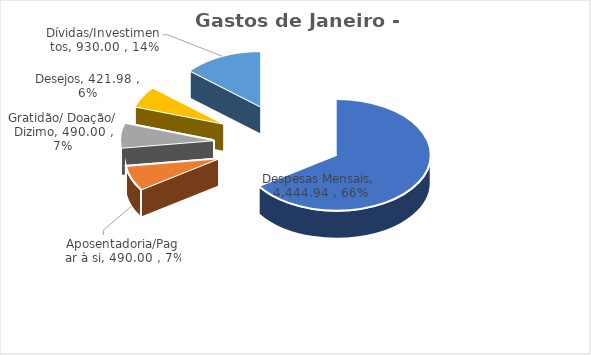
| Category | Gastos de Janeiro - Real |
|---|---|
| Despesas Mensais | 4444.94 |
| Aposentadoria/Pagar à si | 490 |
| Gratidão/ Doação/ Dizimo | 490 |
| Desejos | 421.98 |
| Dívidas/Investimentos | 930 |